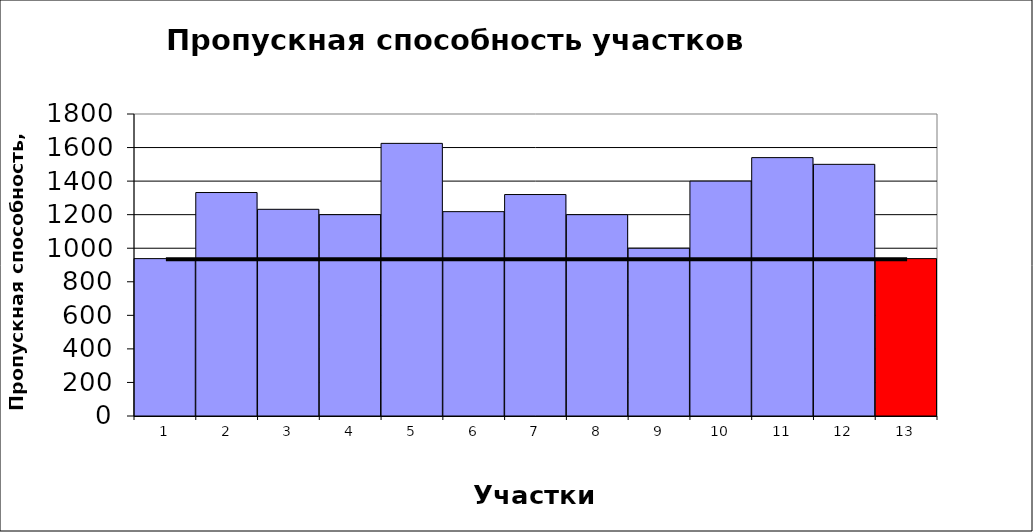
| Category | Пропускная способность участка, ткм в год |
|---|---|
| 1.0 | 938 |
| 2.0 | 1332 |
| 3.0 | 1232 |
| 4.0 | 1200 |
| 5.0 | 1625 |
| 6.0 | 1218 |
| 7.0 | 1320 |
| 8.0 | 1200 |
| 9.0 | 1000 |
| 10.0 | 1400 |
| 11.0 | 1540 |
| 12.0 | 1500 |
| 13.0 | 938 |